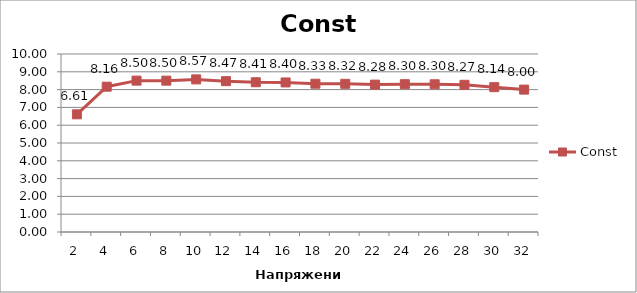
| Category | Const |
|---|---|
| 2.0 | 6.612 |
| 4.0 | 8.163 |
| 6.0 | 8.503 |
| 8.0 | 8.502 |
| 10.0 | 8.573 |
| 12.0 | 8.474 |
| 14.0 | 8.413 |
| 16.0 | 8.402 |
| 18.0 | 8.33 |
| 20.0 | 8.325 |
| 22.0 | 8.28 |
| 24.0 | 8.304 |
| 26.0 | 8.299 |
| 28.0 | 8.27 |
| 30.0 | 8.138 |
| 32.0 | 8 |